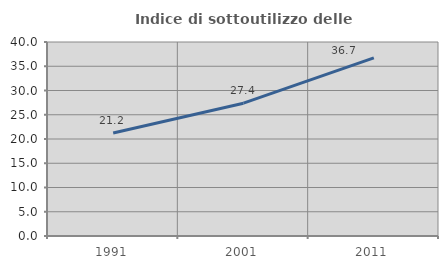
| Category | Indice di sottoutilizzo delle abitazioni  |
|---|---|
| 1991.0 | 21.226 |
| 2001.0 | 27.382 |
| 2011.0 | 36.719 |